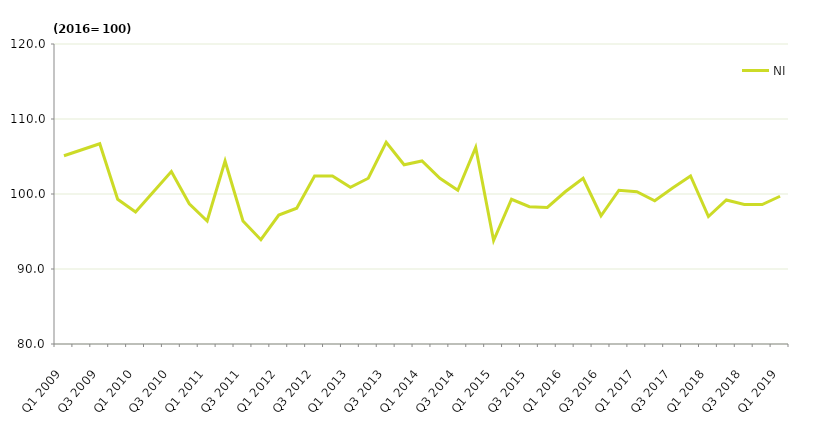
| Category | NI |
|---|---|
| Q1 2009 | 105.1 |
| Q2 2009 | 105.9 |
| Q3 2009 | 106.7 |
| Q4 2009 | 99.3 |
| Q1 2010 | 97.6 |
| Q2 2010 | 100.3 |
| Q3 2010 | 103 |
| Q4 2010 | 98.7 |
| Q1 2011 | 96.4 |
| Q2 2011 | 104.4 |
| Q3 2011 | 96.4 |
| Q4 2011 | 93.9 |
| Q1 2012 | 97.2 |
| Q2 2012 | 98.1 |
| Q3 2012 | 102.4 |
| Q4 2012 | 102.4 |
| Q1 2013 | 100.9 |
| Q2 2013 | 102.1 |
| Q3 2013 | 106.9 |
| Q4 2013 | 103.9 |
| Q1 2014 | 104.4 |
| Q2 2014 | 102.1 |
| Q3 2014 | 100.5 |
| Q4 2014 | 106.2 |
| Q1 2015 | 93.8 |
| Q2 2015 | 99.3 |
| Q3 2015 | 98.3 |
| Q4 2015 | 98.2 |
| Q1 2016 | 100.3 |
| Q2 2016 | 102.1 |
| Q3 2016 | 97.1 |
| Q4 2016 | 100.5 |
| Q1 2017 | 100.3 |
| Q2 2017 | 99.1 |
| Q3 2017 | 100.8 |
| Q4 2017 | 102.4 |
| Q1 2018 | 97 |
| Q2 2018 | 99.2 |
| Q3 2018 | 98.6 |
| Q4 2018 | 98.6 |
| Q1 2019 | 99.7 |